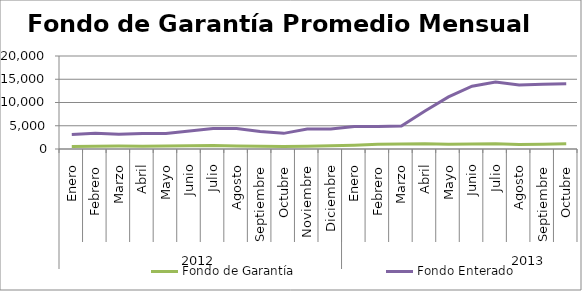
| Category | Fondo de Garantía | Fondo Enterado |
|---|---|---|
| 0 | 560.173 | 3141.641 |
| 1 | 575.916 | 3362.648 |
| 2 | 622.075 | 3154.118 |
| 3 | 612.299 | 3348.058 |
| 4 | 654.277 | 3308.859 |
| 5 | 675.965 | 3850.375 |
| 6 | 729.97 | 4400.539 |
| 7 | 649.095 | 4383.327 |
| 8 | 606.03 | 3757.632 |
| 9 | 525.314 | 3362.932 |
| 10 | 591.646 | 4285.609 |
| 11 | 703.403 | 4296.87 |
| 12 | 823.344 | 4842.786 |
| 13 | 1008.855 | 4845.136 |
| 14 | 1091.101 | 4938.365 |
| 15 | 1128.09 | 8179.666 |
| 16 | 1047.818 | 11202.213 |
| 17 | 1079.154 | 13493.433 |
| 18 | 1130.244 | 14387.844 |
| 19 | 950.791 | 13769.803 |
| 20 | 1002.474 | 13899.147 |
| 21 | 1106.654 | 14005.922 |